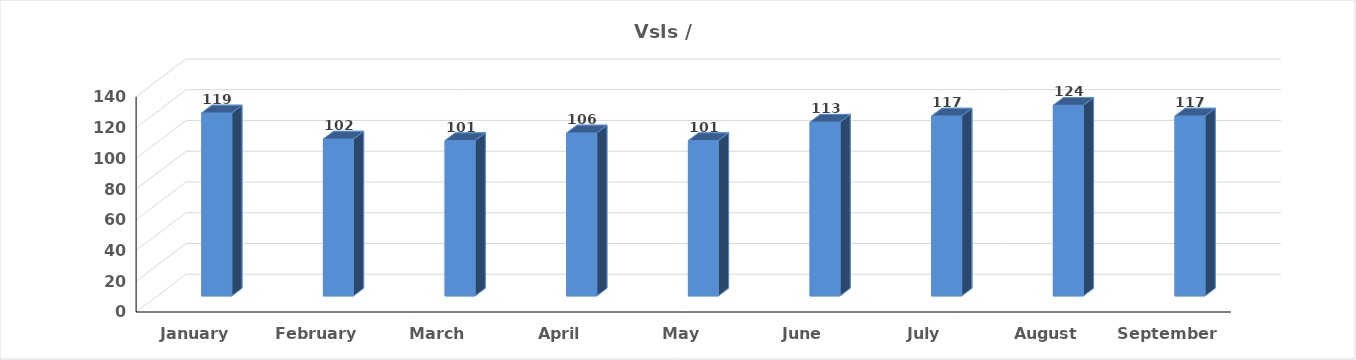
| Category | Vsls |
|---|---|
| January | 119 |
| February | 102 |
| March | 101 |
| April | 106 |
| May | 101 |
| June | 113 |
| July | 117 |
| August | 124 |
| September | 117 |